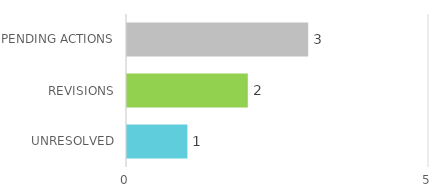
| Category | Series 1 |
|---|---|
| UNRESOLVED | 1 |
| REVISIONS | 2 |
| PENDING ACTIONS | 3 |